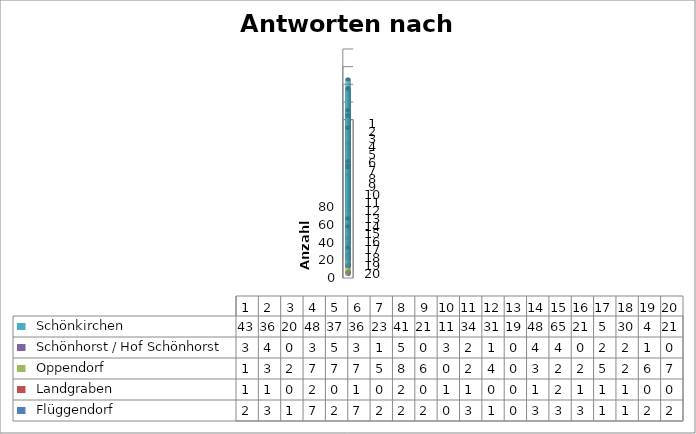
| Category |   Flüggendorf   |   Landgraben   |   Oppendorf   |   Schönhorst / Hof Schönhorst   |   Schönkirchen   |
|---|---|---|---|---|---|
| 0 | 2 | 1 | 1 | 3 | 43 |
| 1 | 3 | 1 | 3 | 4 | 36 |
| 2 | 1 | 0 | 2 | 0 | 20 |
| 3 | 7 | 2 | 7 | 3 | 48 |
| 4 | 2 | 0 | 7 | 5 | 37 |
| 5 | 7 | 1 | 7 | 3 | 36 |
| 6 | 2 | 0 | 5 | 1 | 23 |
| 7 | 2 | 2 | 8 | 5 | 41 |
| 8 | 2 | 0 | 6 | 0 | 21 |
| 9 | 0 | 1 | 0 | 3 | 11 |
| 10 | 3 | 1 | 2 | 2 | 34 |
| 11 | 1 | 0 | 4 | 1 | 31 |
| 12 | 0 | 0 | 0 | 0 | 19 |
| 13 | 3 | 1 | 3 | 4 | 48 |
| 14 | 3 | 2 | 2 | 4 | 65 |
| 15 | 3 | 1 | 2 | 0 | 21 |
| 16 | 1 | 1 | 5 | 2 | 5 |
| 17 | 1 | 1 | 2 | 2 | 30 |
| 18 | 2 | 0 | 6 | 1 | 4 |
| 19 | 2 | 0 | 7 | 0 | 21 |